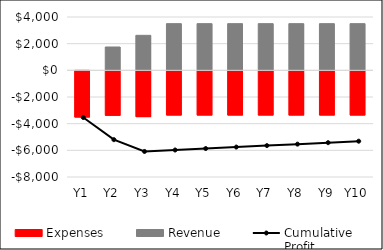
| Category | Expenses | Revenue |
|---|---|---|
| Y1 | -3540 | 0 |
| Y2 | -3410 | 1750 |
| Y3 | -3510 | 2625 |
| Y4 | -3390 | 3500 |
| Y5 | -3390 | 3500 |
| Y6 | -3390 | 3500 |
| Y7 | -3390 | 3500 |
| Y8 | -3390 | 3500 |
| Y9 | -3390 | 3500 |
| Y10 | -3390 | 3500 |